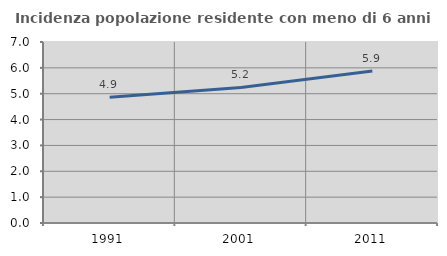
| Category | Incidenza popolazione residente con meno di 6 anni |
|---|---|
| 1991.0 | 4.866 |
| 2001.0 | 5.241 |
| 2011.0 | 5.877 |